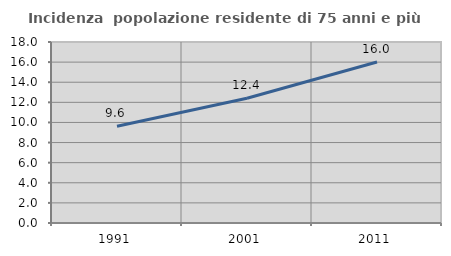
| Category | Incidenza  popolazione residente di 75 anni e più |
|---|---|
| 1991.0 | 9.617 |
| 2001.0 | 12.402 |
| 2011.0 | 16.004 |